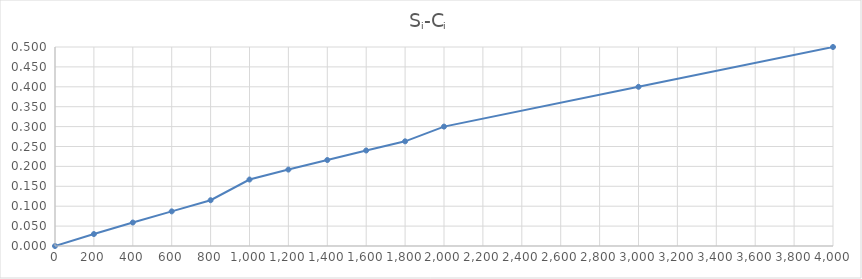
| Category | Series 0 |
|---|---|
| 0.0 | 0 |
| 200.0 | 0.03 |
| 400.0 | 0.059 |
| 600.0 | 0.087 |
| 800.0 | 0.115 |
| 1000.0 | 0.167 |
| 1200.0 | 0.192 |
| 1400.0 | 0.216 |
| 1600.0 | 0.24 |
| 1800.0 | 0.263 |
| 2000.0 | 0.3 |
| 3000.0 | 0.4 |
| 4000.0 | 0.5 |